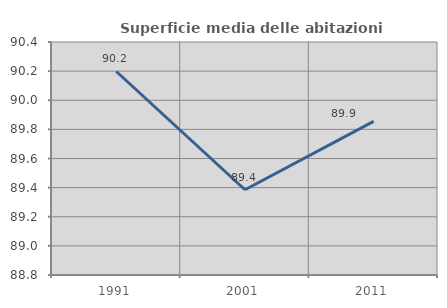
| Category | Superficie media delle abitazioni occupate |
|---|---|
| 1991.0 | 90.197 |
| 2001.0 | 89.385 |
| 2011.0 | 89.855 |